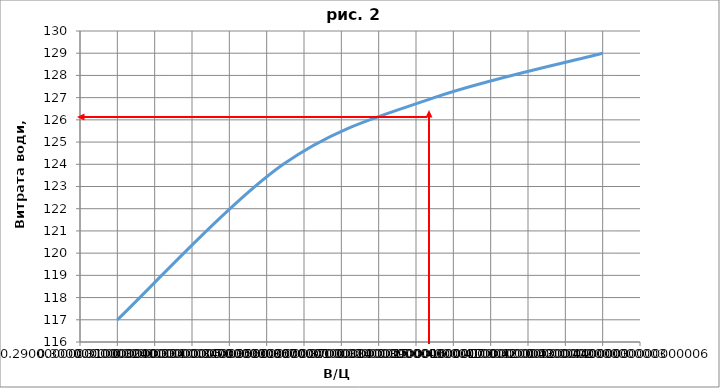
| Category | Series 0 |
|---|---|
| 0.43 | 129 |
| 0.38484848484848483 | 127 |
| 0.34444444444444444 | 124 |
| 0.3 | 117 |